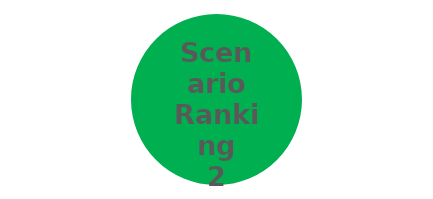
| Category | Scenario Ranking |
|---|---|
| 0 | 2 |